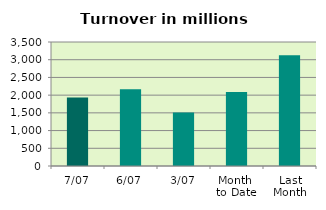
| Category | Series 0 |
|---|---|
| 7/07 | 1935.025 |
| 6/07 | 2162.911 |
| 3/07 | 1512.395 |
| Month 
to Date | 2090.21 |
| Last
Month | 3125.17 |